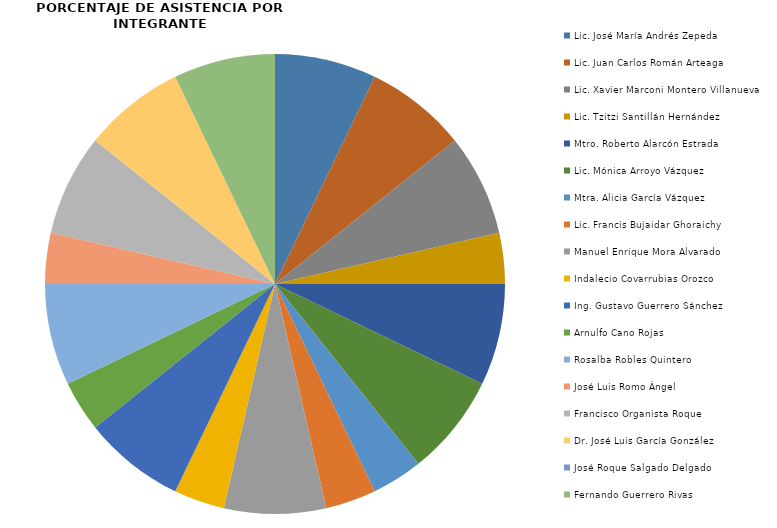
| Category | Series 0 |
|---|---|
| Lic. José María Andrés Zepeda | 2 |
| Lic. Juan Carlos Román Arteaga  | 2 |
| Lic. Xavier Marconi Montero Villanueva | 2 |
| Lic. Tzitzi Santillán Hernández | 1 |
| Mtro. Roberto Alarcón Estrada | 2 |
| Lic. Mónica Arroyo Vázquez | 2 |
| Mtra. Alicia García Vázquez | 1 |
| Lic. Francis Bujaidar Ghoraichy | 1 |
| Manuel Enrique Mora Alvarado | 2 |
| Indalecio Covarrubias Orozco  | 1 |
| Ing. Gustavo Guerrero Sánchez  | 2 |
| Arnulfo Cano Rojas | 1 |
| Rosalba Robles Quintero | 2 |
| José Luis Romo Ángel  | 1 |
| Francisco Organista Roque | 2 |
| Dr. José Luis García González  | 2 |
| José Roque Salgado Delgado  | 0 |
| Fernando Guerrero Rivas  | 2 |